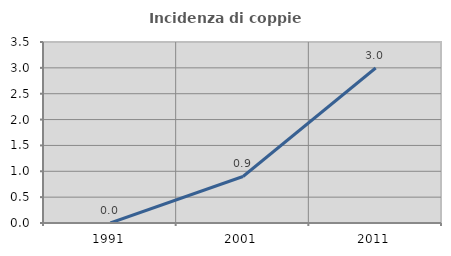
| Category | Incidenza di coppie miste |
|---|---|
| 1991.0 | 0 |
| 2001.0 | 0.899 |
| 2011.0 | 2.997 |